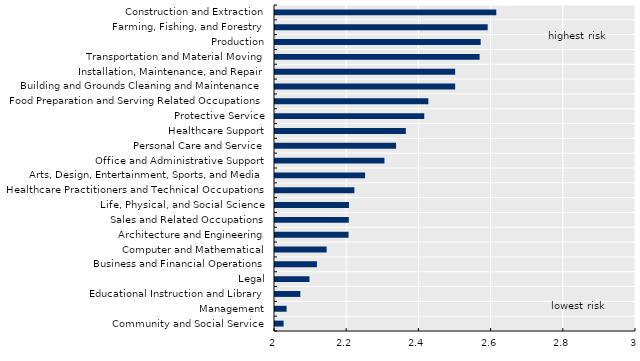
| Category | autom_mean_std2 |
|---|---|
| Community and Social Service | 2.024 |
| Management | 2.032 |
| Educational Instruction and Library | 2.07 |
| Legal | 2.095 |
| Business and Financial Operations | 2.116 |
| Computer and Mathematical | 2.143 |
| Architecture and Engineering | 2.204 |
| Sales and Related Occupations | 2.204 |
| Life, Physical, and Social Science | 2.205 |
| Healthcare Practitioners and Technical Occupations | 2.22 |
| Arts, Design, Entertainment, Sports, and Media | 2.25 |
| Office and Administrative Support | 2.303 |
| Personal Care and Service | 2.335 |
| Healthcare Support | 2.362 |
| Protective Service | 2.413 |
| Food Preparation and Serving Related Occupations | 2.425 |
| Building and Grounds Cleaning and Maintenance | 2.499 |
| Installation, Maintenance, and Repair | 2.499 |
| Transportation and Material Moving | 2.567 |
| Production | 2.57 |
| Farming, Fishing, and Forestry | 2.589 |
| Construction and Extraction | 2.613 |